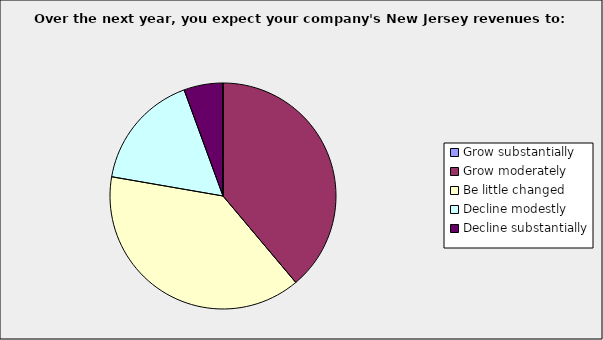
| Category | Series 0 |
|---|---|
| Grow substantially | 0 |
| Grow moderately | 0.389 |
| Be little changed | 0.389 |
| Decline modestly | 0.167 |
| Decline substantially | 0.056 |